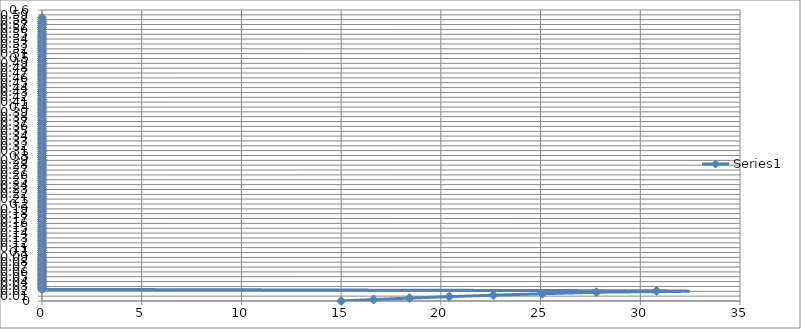
| Category | Series 0 |
|---|---|
| 15.0 | 0 |
| 16.625009061629257 | 0.003 |
| 18.426061753283655 | 0.006 |
| 20.422229574565403 | 0.009 |
| 22.63465011572152 | 0.012 |
| 25.086750885378528 | 0.015 |
| 27.804497386416916 | 0.018 |
| 30.816668066881885 | 0.021 |